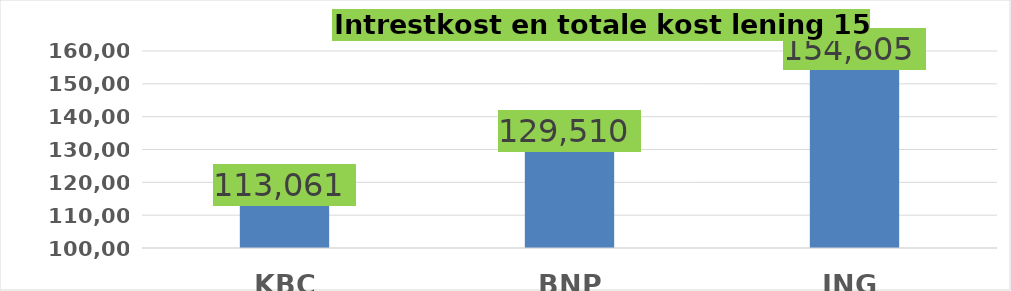
| Category | Totale kost |
|---|---|
| KBC | 113061.4 |
| BNP | 129510.15 |
| ING | 154605.23 |